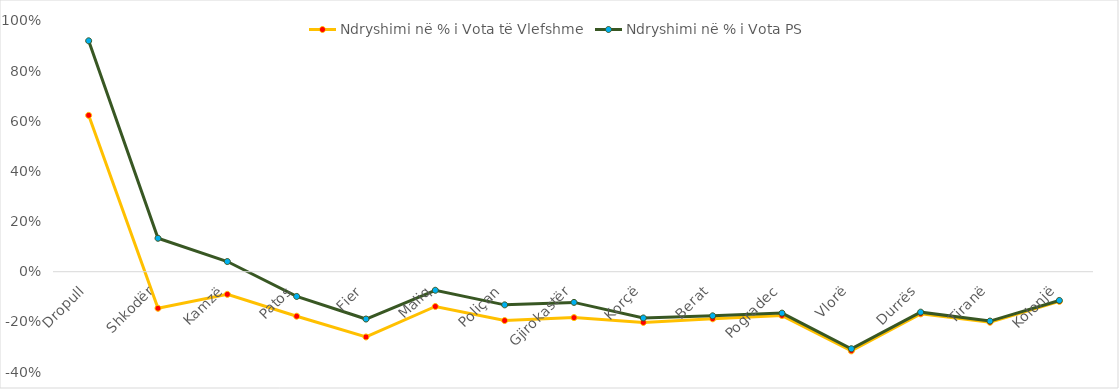
| Category | Ndryshimi në % i Vota të Vlefshme | Ndryshimi në % i Vota PS |
|---|---|---|
| Dropull | 0.624 | 0.921 |
| Shkodër | -0.146 | 0.133 |
| Kamzë | -0.09 | 0.041 |
| Patos | -0.178 | -0.099 |
| Fier | -0.26 | -0.189 |
| Maliq | -0.139 | -0.074 |
| Poliçan | -0.195 | -0.132 |
| Gjirokastër | -0.183 | -0.122 |
| Korçë | -0.202 | -0.184 |
| Berat | -0.188 | -0.176 |
| Pogradec | -0.175 | -0.165 |
| Vlorë | -0.316 | -0.307 |
| Durrës | -0.168 | -0.161 |
| Tiranë | -0.202 | -0.197 |
| Kolonjë | -0.118 | -0.115 |